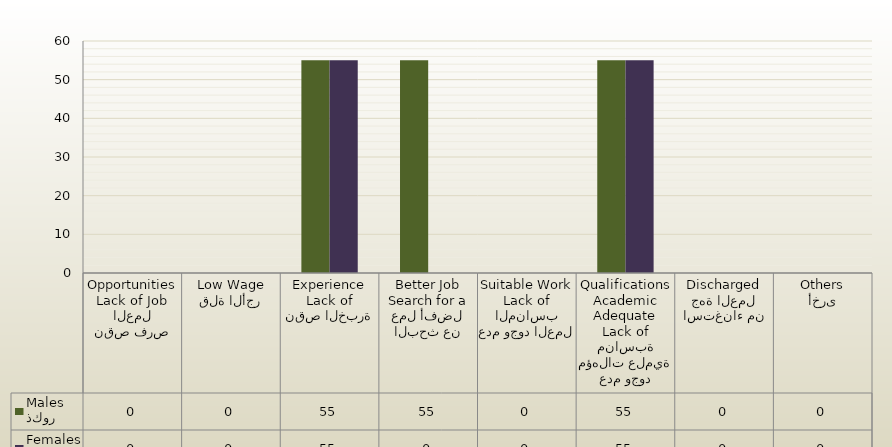
| Category | ذكور
Males | اناث
Females |
|---|---|---|
| نقص فرص العمل
Lack of Job Opportunities | 0 | 0 |
| قلة الأجر
Low Wage | 0 | 0 |
| نقص الخبرة
Lack of Experience | 55 | 55 |
| البحث عن عمل أفضل
Search for a Better Job | 55 | 0 |
| عدم وجود العمل المناسب
Lack of Suitable Work | 0 | 0 |
| عدم وجود مؤهلات علمية مناسبة
Lack of Adequate Academic Qualifications | 55 | 55 |
| استغناء من جهة العمل
Discharged | 0 | 0 |
| أخرى
Others | 0 | 0 |